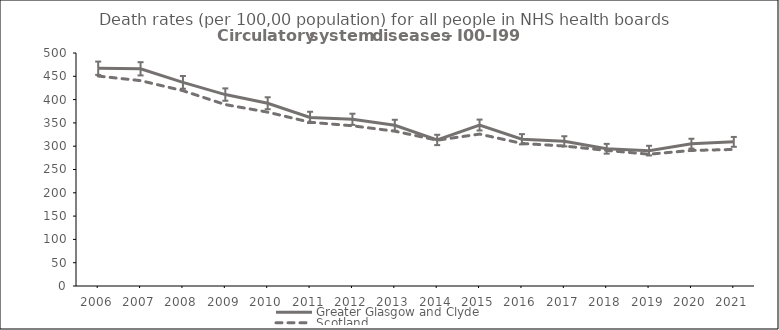
| Category | Greater Glasgow and Clyde | Scotland |
|---|---|---|
| 2006.0 | 467.3 | 450.5 |
| 2007.0 | 466.1 | 440.7 |
| 2008.0 | 437 | 419.1 |
| 2009.0 | 410.8 | 389.3 |
| 2010.0 | 392.2 | 373.1 |
| 2011.0 | 361.8 | 351.4 |
| 2012.0 | 357.7 | 343.8 |
| 2013.0 | 344.9 | 332.2 |
| 2014.0 | 313.4 | 312.9 |
| 2015.0 | 345.4 | 326 |
| 2016.0 | 314.9 | 305.9 |
| 2017.0 | 310.5 | 300.4 |
| 2018.0 | 294.5 | 290.9 |
| 2019.0 | 290.5 | 282.8 |
| 2020.0 | 305.4 | 290.9 |
| 2021.0 | 309.3 | 293 |